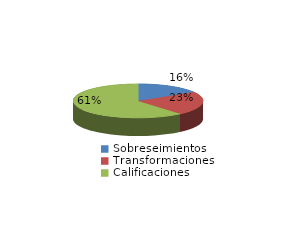
| Category | Series 0 |
|---|---|
| Sobreseimientos | 3508 |
| Transformaciones | 4864 |
| Calificaciones | 13173 |